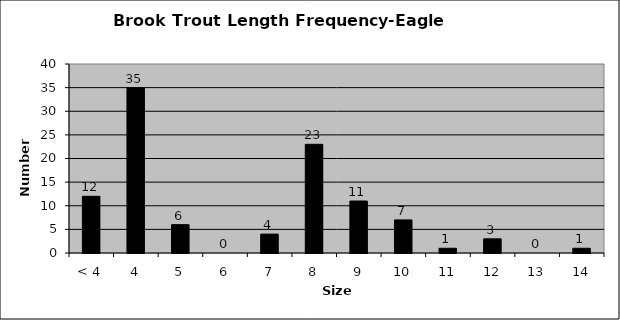
| Category | Series 0 |
|---|---|
| < 4 | 12 |
| 4 | 35 |
| 5 | 6 |
| 6 | 0 |
| 7 | 4 |
| 8 | 23 |
| 9 | 11 |
| 10 | 7 |
| 11 | 1 |
| 12 | 3 |
| 13 | 0 |
| 14 | 1 |